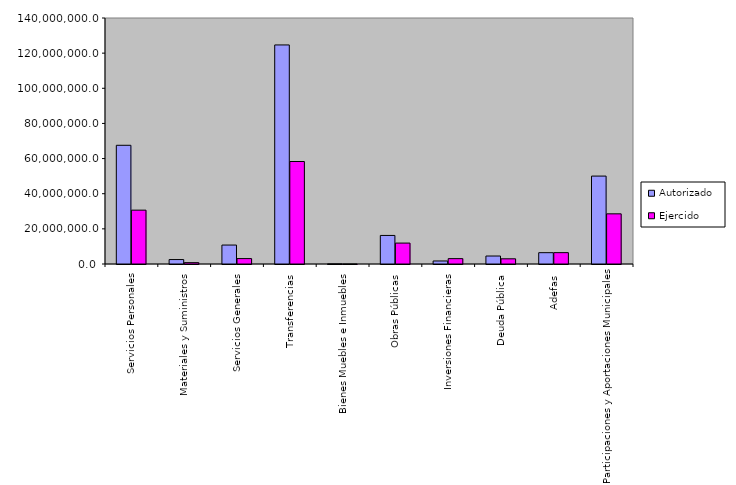
| Category | Autorizado | Ejercido |
|---|---|---|
| 0 | 67555296.6 | 30650592.1 |
| 1 | 2531108.6 | 772559 |
| 2 | 10779101.4 | 3083780.1 |
| 3 | 124668846.9 | 58326081.1 |
| 4 | 85214.2 | 151.3 |
| 5 | 16247297.2 | 11898546.2 |
| 6 | 1722832 | 3050469.9 |
| 7 | 4541774.766 | 2958280.5 |
| 8 | 6442504.4 | 6457076.2 |
| 9 | 50035957.4 | 28550184.6 |